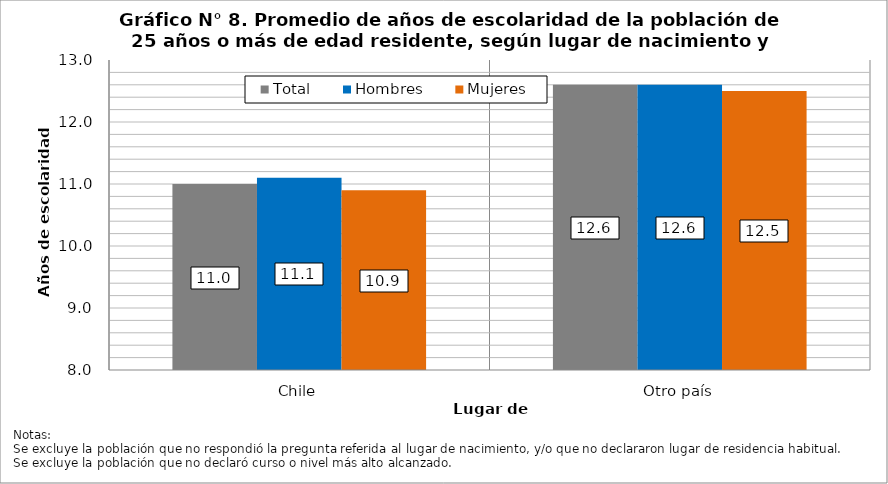
| Category | Total | Hombres | Mujeres |
|---|---|---|---|
| Chile | 11 | 11.1 | 10.9 |
| Otro país | 12.6 | 12.6 | 12.5 |